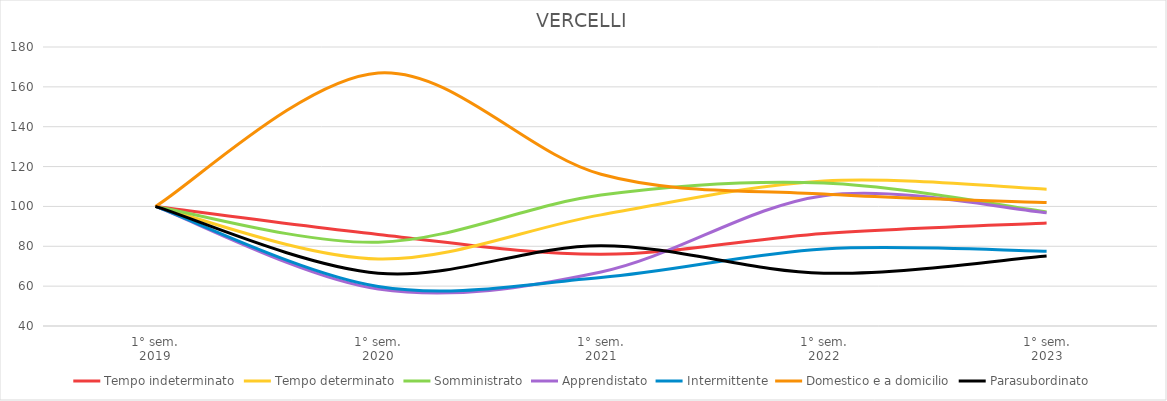
| Category | Tempo indeterminato | Tempo determinato | Somministrato | Apprendistato | Intermittente | Domestico e a domicilio | Parasubordinato |
|---|---|---|---|---|---|---|---|
| 1° sem.
2019 | 100 | 100 | 100 | 100 | 100 | 100 | 100 |
| 1° sem.
2020 | 85.97 | 73.635 | 82.018 | 58.559 | 59.818 | 166.998 | 66.486 |
| 1° sem.
2021 | 75.989 | 95.761 | 105.69 | 67.117 | 64.359 | 116.129 | 80.27 |
| 1° sem.
2022 | 86.441 | 112.813 | 111.76 | 105.405 | 78.661 | 106.203 | 66.486 |
| 1° sem.
2023 | 91.714 | 108.671 | 97.269 | 96.847 | 77.526 | 101.985 | 75.135 |